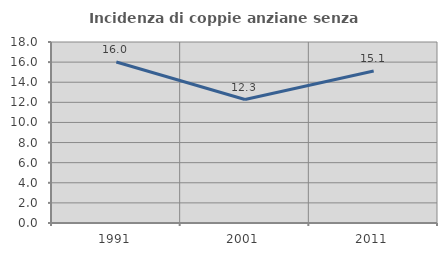
| Category | Incidenza di coppie anziane senza figli  |
|---|---|
| 1991.0 | 16.014 |
| 2001.0 | 12.281 |
| 2011.0 | 15.12 |